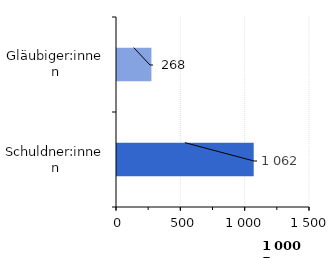
| Category | Series 0 |
|---|---|
| Gläubiger:innen | 267.672 |
| Schuldner:innen | 1062.466 |